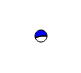
| Category | Series 0 |
|---|---|
| 0 | 1175717 |
| 1 | 1399780 |